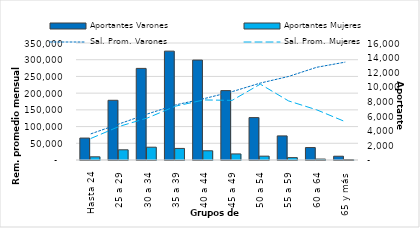
| Category | Aportantes Varones | Aportantes Mujeres |
|---|---|---|
| Hasta 24 | 3000 | 435 |
| 25 a 29 | 8165 | 1394 |
| 30 a 34 | 12526 | 1751 |
| 35 a 39 | 14888 | 1582 |
| 40 a 44 | 13663 | 1261 |
| 45 a 49 | 9490 | 831 |
| 50 a 54 | 5798 | 525 |
| 55 a 59 | 3294 | 326 |
| 60 a 64 | 1702 | 128 |
| 65 y más | 516 | 50 |